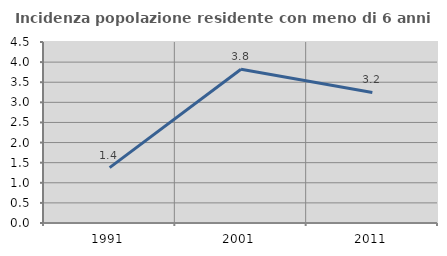
| Category | Incidenza popolazione residente con meno di 6 anni |
|---|---|
| 1991.0 | 1.376 |
| 2001.0 | 3.822 |
| 2011.0 | 3.247 |